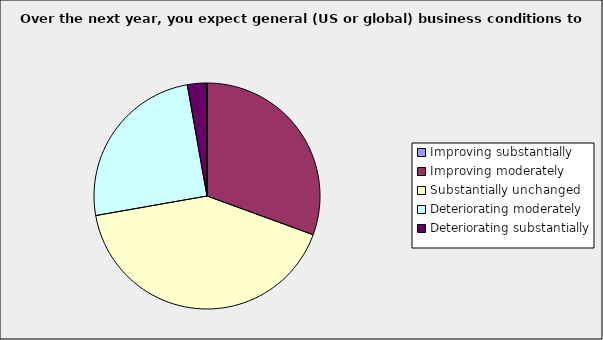
| Category | Series 0 |
|---|---|
| Improving substantially | 0 |
| Improving moderately | 0.306 |
| Substantially unchanged | 0.417 |
| Deteriorating moderately | 0.25 |
| Deteriorating substantially | 0.028 |